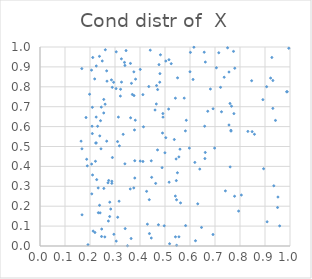
| Category | Series 0 |
|---|---|
| -100.0 | -100000 |
| -100.0 | -100000 |
| 0.19187879786047768 | 0.007 |
| -100.0 | -100000 |
| -100.0 | -100000 |
| -100.0 | -100000 |
| -100.0 | -100000 |
| -100.0 | -100000 |
| -100.0 | -100000 |
| -100.0 | -100000 |
| -100.0 | -100000 |
| -100.0 | -100000 |
| 0.4296224976861439 | 0.11 |
| -100.0 | -100000 |
| -100.0 | -100000 |
| -100.0 | -100000 |
| -100.0 | -100000 |
| -100.0 | -100000 |
| -100.0 | -100000 |
| -100.0 | -100000 |
| -100.0 | -100000 |
| -100.0 | -100000 |
| -100.0 | -100000 |
| -100.0 | -100000 |
| 0.2251686918316177 | 0.905 |
| -100.0 | -100000 |
| -100.0 | -100000 |
| -100.0 | -100000 |
| -100.0 | -100000 |
| -100.0 | -100000 |
| -100.0 | -100000 |
| -100.0 | -100000 |
| -100.0 | -100000 |
| -100.0 | -100000 |
| -100.0 | -100000 |
| -100.0 | -100000 |
| -100.0 | -100000 |
| -100.0 | -100000 |
| 0.20939885757398724 | 0.697 |
| -100.0 | -100000 |
| 0.5816440431107636 | 0.578 |
| -100.0 | -100000 |
| -100.0 | -100000 |
| -100.0 | -100000 |
| -100.0 | -100000 |
| -100.0 | -100000 |
| -100.0 | -100000 |
| -100.0 | -100000 |
| -100.0 | -100000 |
| -100.0 | -100000 |
| -100.0 | -100000 |
| -100.0 | -100000 |
| -100.0 | -100000 |
| -100.0 | -100000 |
| -100.0 | -100000 |
| -100.0 | -100000 |
| -100.0 | -100000 |
| -100.0 | -100000 |
| 0.7637295574614567 | 0.581 |
| 0.3050601643916153 | 0.025 |
| -100.0 | -100000 |
| 0.2553474817145608 | 0.289 |
| -100.0 | -100000 |
| -100.0 | -100000 |
| 0.49203139905379956 | 0.648 |
| 0.2667020137794205 | 0.88 |
| 0.9065603821030419 | 0.8 |
| 0.18915653105718144 | 0.403 |
| -100.0 | -100000 |
| -100.0 | -100000 |
| -100.0 | -100000 |
| -100.0 | -100000 |
| -100.0 | -100000 |
| -100.0 | -100000 |
| -100.0 | -100000 |
| -100.0 | -100000 |
| -100.0 | -100000 |
| -100.0 | -100000 |
| -100.0 | -100000 |
| 0.7639932975936461 | 0.577 |
| -100.0 | -100000 |
| -100.0 | -100000 |
| -100.0 | -100000 |
| -100.0 | -100000 |
| -100.0 | -100000 |
| -100.0 | -100000 |
| -100.0 | -100000 |
| -100.0 | -100000 |
| -100.0 | -100000 |
| -100.0 | -100000 |
| -100.0 | -100000 |
| -100.0 | -100000 |
| -100.0 | -100000 |
| -100.0 | -100000 |
| -100.0 | -100000 |
| 0.3822589108104296 | 0.838 |
| -100.0 | -100000 |
| -100.0 | -100000 |
| -100.0 | -100000 |
| -100.0 | -100000 |
| -100.0 | -100000 |
| -100.0 | -100000 |
| -100.0 | -100000 |
| -100.0 | -100000 |
| -100.0 | -100000 |
| -100.0 | -100000 |
| -100.0 | -100000 |
| -100.0 | -100000 |
| -100.0 | -100000 |
| -100.0 | -100000 |
| 0.5496870743826148 | 0.368 |
| -100.0 | -100000 |
| -100.0 | -100000 |
| -100.0 | -100000 |
| -100.0 | -100000 |
| -100.0 | -100000 |
| 0.9418769743370389 | 0.631 |
| 0.3256701429219151 | 0.94 |
| 0.7740199675463291 | 0.978 |
| -100.0 | -100000 |
| 0.16433612483010096 | 0.527 |
| -100.0 | -100000 |
| 0.681617395554677 | 0.789 |
| -100.0 | -100000 |
| -100.0 | -100000 |
| -100.0 | -100000 |
| -100.0 | -100000 |
| 0.5502491938861755 | 0.845 |
| -100.0 | -100000 |
| -100.0 | -100000 |
| -100.0 | -100000 |
| 0.3327204524582331 | 0.561 |
| -100.0 | -100000 |
| -100.0 | -100000 |
| -100.0 | -100000 |
| -100.0 | -100000 |
| -100.0 | -100000 |
| -100.0 | -100000 |
| -100.0 | -100000 |
| -100.0 | -100000 |
| -100.0 | -100000 |
| -100.0 | -100000 |
| -100.0 | -100000 |
| -100.0 | -100000 |
| -100.0 | -100000 |
| -100.0 | -100000 |
| -100.0 | -100000 |
| -100.0 | -100000 |
| 0.282922323134851 | 0.186 |
| -100.0 | -100000 |
| 0.6611241601250445 | 0.47 |
| -100.0 | -100000 |
| -100.0 | -100000 |
| 0.25502019649960594 | 0.737 |
| -100.0 | -100000 |
| 0.34988766715490793 | 0.001 |
| -100.0 | -100000 |
| -100.0 | -100000 |
| -100.0 | -100000 |
| 0.4466318419540014 | 0.345 |
| -100.0 | -100000 |
| -100.0 | -100000 |
| -100.0 | -100000 |
| -100.0 | -100000 |
| 0.4704986228340291 | 0.786 |
| -100.0 | -100000 |
| -100.0 | -100000 |
| -100.0 | -100000 |
| -100.0 | -100000 |
| -100.0 | -100000 |
| -100.0 | -100000 |
| -100.0 | -100000 |
| -100.0 | -100000 |
| -100.0 | -100000 |
| -100.0 | -100000 |
| 0.6155970152128075 | 0.999 |
| -100.0 | -100000 |
| -100.0 | -100000 |
| -100.0 | -100000 |
| -100.0 | -100000 |
| -100.0 | -100000 |
| 0.21974380534102522 | 0.068 |
| -100.0 | -100000 |
| -100.0 | -100000 |
| -100.0 | -100000 |
| -100.0 | -100000 |
| -100.0 | -100000 |
| -100.0 | -100000 |
| -100.0 | -100000 |
| -100.0 | -100000 |
| -100.0 | -100000 |
| -100.0 | -100000 |
| -100.0 | -100000 |
| -100.0 | -100000 |
| -100.0 | -100000 |
| 0.37521510980602013 | 0.292 |
| -100.0 | -100000 |
| -100.0 | -100000 |
| -100.0 | -100000 |
| 0.3624422175529668 | 0.644 |
| -100.0 | -100000 |
| -100.0 | -100000 |
| -100.0 | -100000 |
| 0.44523287967693836 | 0.04 |
| 0.4789717255678654 | 0.823 |
| -100.0 | -100000 |
| -100.0 | -100000 |
| -100.0 | -100000 |
| -100.0 | -100000 |
| -100.0 | -100000 |
| -100.0 | -100000 |
| -100.0 | -100000 |
| -100.0 | -100000 |
| 0.4351982912702477 | 0.801 |
| 0.7599091323669214 | 0.716 |
| -100.0 | -100000 |
| 0.278606509897224 | 0.148 |
| -100.0 | -100000 |
| -100.0 | -100000 |
| -100.0 | -100000 |
| 0.5852058785735164 | 0.632 |
| 0.2613730196282348 | 0.986 |
| -100.0 | -100000 |
| -100.0 | -100000 |
| -100.0 | -100000 |
| -100.0 | -100000 |
| 0.8315266321342155 | 0.576 |
| -100.0 | -100000 |
| -100.0 | -100000 |
| -100.0 | -100000 |
| 0.6596618350748987 | 0.439 |
| -100.0 | -100000 |
| -100.0 | -100000 |
| -100.0 | -100000 |
| -100.0 | -100000 |
| -100.0 | -100000 |
| -100.0 | -100000 |
| -100.0 | -100000 |
| 0.7503182706500822 | 0.996 |
| -100.0 | -100000 |
| -100.0 | -100000 |
| -100.0 | -100000 |
| -100.0 | -100000 |
| -100.0 | -100000 |
| -100.0 | -100000 |
| -100.0 | -100000 |
| -100.0 | -100000 |
| -100.0 | -100000 |
| -100.0 | -100000 |
| -100.0 | -100000 |
| -100.0 | -100000 |
| -100.0 | -100000 |
| -100.0 | -100000 |
| -100.0 | -100000 |
| -100.0 | -100000 |
| -100.0 | -100000 |
| -100.0 | -100000 |
| -100.0 | -100000 |
| -100.0 | -100000 |
| -100.0 | -100000 |
| -100.0 | -100000 |
| -100.0 | -100000 |
| -100.0 | -100000 |
| -100.0 | -100000 |
| -100.0 | -100000 |
| -100.0 | -100000 |
| -100.0 | -100000 |
| -100.0 | -100000 |
| -100.0 | -100000 |
| -100.0 | -100000 |
| -100.0 | -100000 |
| -100.0 | -100000 |
| -100.0 | -100000 |
| 0.33795944759262986 | 0.923 |
| -100.0 | -100000 |
| -100.0 | -100000 |
| -100.0 | -100000 |
| -100.0 | -100000 |
| -100.0 | -100000 |
| -100.0 | -100000 |
| -100.0 | -100000 |
| 0.23914817014861622 | 0.553 |
| -100.0 | -100000 |
| -100.0 | -100000 |
| -100.0 | -100000 |
| -100.0 | -100000 |
| -100.0 | -100000 |
| 0.24680507783390082 | 0.085 |
| -100.0 | -100000 |
| 0.23783188197156513 | 0.953 |
| -100.0 | -100000 |
| -100.0 | -100000 |
| -100.0 | -100000 |
| -100.0 | -100000 |
| -100.0 | -100000 |
| -100.0 | -100000 |
| 0.34424693027069375 | 0.982 |
| -100.0 | -100000 |
| -100.0 | -100000 |
| -100.0 | -100000 |
| -100.0 | -100000 |
| -100.0 | -100000 |
| -100.0 | -100000 |
| -100.0 | -100000 |
| -100.0 | -100000 |
| -100.0 | -100000 |
| -100.0 | -100000 |
| 0.6391309777898468 | 0.387 |
| -100.0 | -100000 |
| 0.16731013530644934 | 0.891 |
| -100.0 | -100000 |
| -100.0 | -100000 |
| -100.0 | -100000 |
| 0.20828665464862384 | 0.602 |
| -100.0 | -100000 |
| -100.0 | -100000 |
| -100.0 | -100000 |
| 0.38118780702664146 | 0.632 |
| -100.0 | -100000 |
| -100.0 | -100000 |
| -100.0 | -100000 |
| -100.0 | -100000 |
| -100.0 | -100000 |
| 0.5032850026031422 | 0.929 |
| 0.6016906126865291 | 0.973 |
| -100.0 | -100000 |
| -100.0 | -100000 |
| 0.23047496795832656 | 0.602 |
| -100.0 | -100000 |
| -100.0 | -100000 |
| -100.0 | -100000 |
| -100.0 | -100000 |
| -100.0 | -100000 |
| -100.0 | -100000 |
| -100.0 | -100000 |
| -100.0 | -100000 |
| 0.37913019498877587 | 0.429 |
| -100.0 | -100000 |
| -100.0 | -100000 |
| -100.0 | -100000 |
| -100.0 | -100000 |
| -100.0 | -100000 |
| -100.0 | -100000 |
| -100.0 | -100000 |
| -100.0 | -100000 |
| -100.0 | -100000 |
| -100.0 | -100000 |
| -100.0 | -100000 |
| -100.0 | -100000 |
| 0.9587002853319889 | 0.101 |
| -100.0 | -100000 |
| 0.30500730674287335 | 0.976 |
| 0.3163226875464985 | 0.225 |
| -100.0 | -100000 |
| -100.0 | -100000 |
| -100.0 | -100000 |
| -100.0 | -100000 |
| -100.0 | -100000 |
| -100.0 | -100000 |
| -100.0 | -100000 |
| -100.0 | -100000 |
| 0.7559870351411391 | 0.874 |
| -100.0 | -100000 |
| -100.0 | -100000 |
| -100.0 | -100000 |
| -100.0 | -100000 |
| -100.0 | -100000 |
| -100.0 | -100000 |
| 0.16779261318989291 | 0.488 |
| -100.0 | -100000 |
| -100.0 | -100000 |
| -100.0 | -100000 |
| -100.0 | -100000 |
| -100.0 | -100000 |
| 0.376183444377469 | 0.756 |
| -100.0 | -100000 |
| -100.0 | -100000 |
| -100.0 | -100000 |
| -100.0 | -100000 |
| -100.0 | -100000 |
| -100.0 | -100000 |
| -100.0 | -100000 |
| -100.0 | -100000 |
| -100.0 | -100000 |
| -100.0 | -100000 |
| 0.6920109922518849 | 0.058 |
| 0.30435218441106715 | 0.791 |
| -100.0 | -100000 |
| -100.0 | -100000 |
| -100.0 | -100000 |
| 0.7943881429237363 | 0.175 |
| -100.0 | -100000 |
| -100.0 | -100000 |
| -100.0 | -100000 |
| -100.0 | -100000 |
| -100.0 | -100000 |
| -100.0 | -100000 |
| -100.0 | -100000 |
| -100.0 | -100000 |
| -100.0 | -100000 |
| -100.0 | -100000 |
| -100.0 | -100000 |
| -100.0 | -100000 |
| -100.0 | -100000 |
| -100.0 | -100000 |
| -100.0 | -100000 |
| 0.20650176269031983 | 0.412 |
| -100.0 | -100000 |
| -100.0 | -100000 |
| -100.0 | -100000 |
| 0.894416459786068 | 0.388 |
| -100.0 | -100000 |
| -100.0 | -100000 |
| 0.5158422454907788 | 0.936 |
| -100.0 | -100000 |
| -100.0 | -100000 |
| -100.0 | -100000 |
| -100.0 | -100000 |
| 0.4263880408014544 | 0.275 |
| -100.0 | -100000 |
| -100.0 | -100000 |
| -100.0 | -100000 |
| -100.0 | -100000 |
| 0.22471361010595137 | 0.648 |
| 0.3175891911530946 | 0.503 |
| -100.0 | -100000 |
| -100.0 | -100000 |
| -100.0 | -100000 |
| -100.0 | -100000 |
| -100.0 | -100000 |
| -100.0 | -100000 |
| -100.0 | -100000 |
| -100.0 | -100000 |
| -100.0 | -100000 |
| -100.0 | -100000 |
| -100.0 | -100000 |
| -100.0 | -100000 |
| -100.0 | -100000 |
| -100.0 | -100000 |
| -100.0 | -100000 |
| -100.0 | -100000 |
| -100.0 | -100000 |
| -100.0 | -100000 |
| 0.4370916397126354 | 0.233 |
| 0.9224302886151942 | 0.844 |
| -100.0 | -100000 |
| -100.0 | -100000 |
| -100.0 | -100000 |
| -100.0 | -100000 |
| -100.0 | -100000 |
| -100.0 | -100000 |
| -100.0 | -100000 |
| -100.0 | -100000 |
| -100.0 | -100000 |
| -100.0 | -100000 |
| -100.0 | -100000 |
| -100.0 | -100000 |
| -100.0 | -100000 |
| 0.37546543730731485 | 0.875 |
| -100.0 | -100000 |
| 0.2187454687769319 | 0.84 |
| -100.0 | -100000 |
| -100.0 | -100000 |
| -100.0 | -100000 |
| -100.0 | -100000 |
| 0.27189752846479587 | 0.318 |
| -100.0 | -100000 |
| -100.0 | -100000 |
| -100.0 | -100000 |
| -100.0 | -100000 |
| -100.0 | -100000 |
| -100.0 | -100000 |
| -100.0 | -100000 |
| -100.0 | -100000 |
| -100.0 | -100000 |
| 0.43771643095411816 | 0.062 |
| -100.0 | -100000 |
| -100.0 | -100000 |
| 0.2228108382298407 | 0.517 |
| 0.7790921357145734 | 0.893 |
| -100.0 | -100000 |
| -100.0 | -100000 |
| -100.0 | -100000 |
| -100.0 | -100000 |
| -100.0 | -100000 |
| -100.0 | -100000 |
| -100.0 | -100000 |
| -100.0 | -100000 |
| -100.0 | -100000 |
| 0.6568691607360193 | 0.974 |
| -100.0 | -100000 |
| -100.0 | -100000 |
| -100.0 | -100000 |
| -100.0 | -100000 |
| -100.0 | -100000 |
| -100.0 | -100000 |
| -100.0 | -100000 |
| -100.0 | -100000 |
| -100.0 | -100000 |
| -100.0 | -100000 |
| -100.0 | -100000 |
| -100.0 | -100000 |
| -100.0 | -100000 |
| -100.0 | -100000 |
| -100.0 | -100000 |
| -100.0 | -100000 |
| 0.23341933274696025 | 0.167 |
| -100.0 | -100000 |
| -100.0 | -100000 |
| -100.0 | -100000 |
| -100.0 | -100000 |
| -100.0 | -100000 |
| -100.0 | -100000 |
| -100.0 | -100000 |
| 0.22512395210268232 | 0.518 |
| -100.0 | -100000 |
| -100.0 | -100000 |
| -100.0 | -100000 |
| -100.0 | -100000 |
| -100.0 | -100000 |
| 0.31070677299256033 | 0.144 |
| -100.0 | -100000 |
| -100.0 | -100000 |
| -100.0 | -100000 |
| -100.0 | -100000 |
| -100.0 | -100000 |
| -100.0 | -100000 |
| -100.0 | -100000 |
| -100.0 | -100000 |
| -100.0 | -100000 |
| -100.0 | -100000 |
| -100.0 | -100000 |
| -100.0 | -100000 |
| -100.0 | -100000 |
| 0.8055011477738415 | 0.256 |
| -100.0 | -100000 |
| -100.0 | -100000 |
| -100.0 | -100000 |
| -100.0 | -100000 |
| -100.0 | -100000 |
| -100.0 | -100000 |
| 0.582386269931465 | 0.103 |
| -100.0 | -100000 |
| -100.0 | -100000 |
| -100.0 | -100000 |
| -100.0 | -100000 |
| -100.0 | -100000 |
| -100.0 | -100000 |
| 0.9353104379878 | 0.302 |
| -100.0 | -100000 |
| -100.0 | -100000 |
| -100.0 | -100000 |
| -100.0 | -100000 |
| -100.0 | -100000 |
| 0.555597384610156 | 0.448 |
| -100.0 | -100000 |
| -100.0 | -100000 |
| -100.0 | -100000 |
| -100.0 | -100000 |
| 0.20932897513727833 | 0.565 |
| -100.0 | -100000 |
| 0.2451965008652771 | 0.698 |
| -100.0 | -100000 |
| -100.0 | -100000 |
| -100.0 | -100000 |
| -100.0 | -100000 |
| -100.0 | -100000 |
| 0.3618406845669442 | 0.918 |
| -100.0 | -100000 |
| 0.27352491304284776 | 0.125 |
| -100.0 | -100000 |
| -100.0 | -100000 |
| 0.698445414171746 | 0.492 |
| 0.8915782337760583 | 0.735 |
| 0.3215353931150503 | 0.753 |
| -100.0 | -100000 |
| 0.5165515494945132 | 0.321 |
| -100.0 | -100000 |
| -100.0 | -100000 |
| -100.0 | -100000 |
| -100.0 | -100000 |
| -100.0 | -100000 |
| 0.736762711610288 | 0.848 |
| -100.0 | -100000 |
| -100.0 | -100000 |
| 0.5462561134884889 | 0.232 |
| 0.37790903698737244 | 0.583 |
| -100.0 | -100000 |
| 0.23821711912621968 | 0.205 |
| 0.3102538954576177 | 0.525 |
| -100.0 | -100000 |
| -100.0 | -100000 |
| -100.0 | -100000 |
| -100.0 | -100000 |
| -100.0 | -100000 |
| 0.9502939386492661 | 0.194 |
| -100.0 | -100000 |
| -100.0 | -100000 |
| -100.0 | -100000 |
| -100.0 | -100000 |
| -100.0 | -100000 |
| -100.0 | -100000 |
| -100.0 | -100000 |
| -100.0 | -100000 |
| -100.0 | -100000 |
| 0.2873610719695805 | 0.315 |
| -100.0 | -100000 |
| 0.6710027540885751 | 0.677 |
| -100.0 | -100000 |
| -100.0 | -100000 |
| -100.0 | -100000 |
| -100.0 | -100000 |
| -100.0 | -100000 |
| -100.0 | -100000 |
| -100.0 | -100000 |
| 0.1866818977305128 | 0.436 |
| -100.0 | -100000 |
| -100.0 | -100000 |
| -100.0 | -100000 |
| 0.4662170571116231 | 0.806 |
| -100.0 | -100000 |
| -100.0 | -100000 |
| -100.0 | -100000 |
| -100.0 | -100000 |
| -100.0 | -100000 |
| -100.0 | -100000 |
| -100.0 | -100000 |
| -100.0 | -100000 |
| -100.0 | -100000 |
| 0.3610351131361368 | 0.287 |
| 0.541670181146668 | 0.743 |
| -100.0 | -100000 |
| -100.0 | -100000 |
| -100.0 | -100000 |
| -100.0 | -100000 |
| 0.7606733434378987 | 0.397 |
| -100.0 | -100000 |
| -100.0 | -100000 |
| -100.0 | -100000 |
| -100.0 | -100000 |
| -100.0 | -100000 |
| -100.0 | -100000 |
| -100.0 | -100000 |
| -100.0 | -100000 |
| -100.0 | -100000 |
| -100.0 | -100000 |
| -100.0 | -100000 |
| -100.0 | -100000 |
| 0.5599872243091598 | 0.486 |
| -100.0 | -100000 |
| -100.0 | -100000 |
| -100.0 | -100000 |
| -100.0 | -100000 |
| -100.0 | -100000 |
| 0.49159442339425374 | 0.666 |
| -100.0 | -100000 |
| 0.9314279714402884 | 0.691 |
| -100.0 | -100000 |
| -100.0 | -100000 |
| -100.0 | -100000 |
| -100.0 | -100000 |
| -100.0 | -100000 |
| -100.0 | -100000 |
| -100.0 | -100000 |
| -100.0 | -100000 |
| -100.0 | -100000 |
| -100.0 | -100000 |
| -100.0 | -100000 |
| -100.0 | -100000 |
| 0.9951383937138106 | 0.994 |
| -100.0 | -100000 |
| 0.21023838530924832 | 0.357 |
| -100.0 | -100000 |
| -100.0 | -100000 |
| 0.24899661968324804 | 0.93 |
| -100.0 | -100000 |
| -100.0 | -100000 |
| -100.0 | -100000 |
| -100.0 | -100000 |
| 0.9315422521077081 | 0.832 |
| -100.0 | -100000 |
| -100.0 | -100000 |
| -100.0 | -100000 |
| -100.0 | -100000 |
| 0.5452791084124988 | 0.329 |
| -100.0 | -100000 |
| -100.0 | -100000 |
| 0.23275767309322692 | 0.292 |
| -100.0 | -100000 |
| -100.0 | -100000 |
| 0.988968515245191 | 0.775 |
| -100.0 | -100000 |
| -100.0 | -100000 |
| 0.597468689486578 | 0.492 |
| -100.0 | -100000 |
| -100.0 | -100000 |
| -100.0 | -100000 |
| -100.0 | -100000 |
| -100.0 | -100000 |
| -100.0 | -100000 |
| -100.0 | -100000 |
| 0.2746716950019883 | 0.329 |
| -100.0 | -100000 |
| 0.20612441613082955 | 0.884 |
| -100.0 | -100000 |
| -100.0 | -100000 |
| 0.5999396826141097 | 0.876 |
| -100.0 | -100000 |
| -100.0 | -100000 |
| -100.0 | -100000 |
| -100.0 | -100000 |
| -100.0 | -100000 |
| 0.21258200194332366 | 0.075 |
| -100.0 | -100000 |
| -100.0 | -100000 |
| -100.0 | -100000 |
| -100.0 | -100000 |
| -100.0 | -100000 |
| -100.0 | -100000 |
| -100.0 | -100000 |
| -100.0 | -100000 |
| -100.0 | -100000 |
| -100.0 | -100000 |
| 0.44105098137775434 | 0.984 |
| -100.0 | -100000 |
| -100.0 | -100000 |
| 0.21110580276425195 | 0.947 |
| -100.0 | -100000 |
| -100.0 | -100000 |
| 0.4116622878513345 | 0.761 |
| -100.0 | -100000 |
| 0.3407192627931094 | 0.087 |
| -100.0 | -100000 |
| -100.0 | -100000 |
| 0.41385437623360777 | 0.599 |
| -100.0 | -100000 |
| 0.4817336766026966 | 0.961 |
| -100.0 | -100000 |
| 0.5248868619039916 | 0.916 |
| 0.6586281720351973 | 0.602 |
| -100.0 | -100000 |
| 0.3223727914639689 | 0.788 |
| -100.0 | -100000 |
| 0.2593472433746231 | 0.046 |
| -100.0 | -100000 |
| -100.0 | -100000 |
| -100.0 | -100000 |
| -100.0 | -100000 |
| -100.0 | -100000 |
| -100.0 | -100000 |
| -100.0 | -100000 |
| -100.0 | -100000 |
| 0.37920057562293696 | 0.342 |
| -100.0 | -100000 |
| -100.0 | -100000 |
| -100.0 | -100000 |
| -100.0 | -100000 |
| -100.0 | -100000 |
| -100.0 | -100000 |
| 0.4996907973285465 | 0.468 |
| -100.0 | -100000 |
| -100.0 | -100000 |
| 0.4653388486033244 | 0.714 |
| -100.0 | -100000 |
| -100.0 | -100000 |
| -100.0 | -100000 |
| -100.0 | -100000 |
| -100.0 | -100000 |
| -100.0 | -100000 |
| 0.5621662886144818 | 0.217 |
| -100.0 | -100000 |
| 0.6613810115313914 | 0.924 |
| -100.0 | -100000 |
| -100.0 | -100000 |
| 0.3694266199553855 | 0.761 |
| 0.4884188600730133 | 0.394 |
| -100.0 | -100000 |
| 0.6193978670536209 | 0.42 |
| -100.0 | -100000 |
| -100.0 | -100000 |
| 0.5557759700371547 | 0.046 |
| 0.1983826988384887 | 0.763 |
| -100.0 | -100000 |
| -100.0 | -100000 |
| -100.0 | -100000 |
| -100.0 | -100000 |
| -100.0 | -100000 |
| -100.0 | -100000 |
| -100.0 | -100000 |
| -100.0 | -100000 |
| -100.0 | -100000 |
| -100.0 | -100000 |
| -100.0 | -100000 |
| 0.7222283674976765 | 0.797 |
| -100.0 | -100000 |
| 0.47975809419131754 | 0.866 |
| -100.0 | -100000 |
| -100.0 | -100000 |
| -100.0 | -100000 |
| -100.0 | -100000 |
| -100.0 | -100000 |
| -100.0 | -100000 |
| -100.0 | -100000 |
| -100.0 | -100000 |
| -100.0 | -100000 |
| -100.0 | -100000 |
| -100.0 | -100000 |
| 0.2891202515745286 | 0.797 |
| -100.0 | -100000 |
| -100.0 | -100000 |
| -100.0 | -100000 |
| -100.0 | -100000 |
| -100.0 | -100000 |
| -100.0 | -100000 |
| -100.0 | -100000 |
| -100.0 | -100000 |
| -100.0 | -100000 |
| -100.0 | -100000 |
| -100.0 | -100000 |
| -100.0 | -100000 |
| -100.0 | -100000 |
| -100.0 | -100000 |
| -100.0 | -100000 |
| -100.0 | -100000 |
| 0.8485638244472773 | 0.575 |
| -100.0 | -100000 |
| -100.0 | -100000 |
| -100.0 | -100000 |
| -100.0 | -100000 |
| -100.0 | -100000 |
| -100.0 | -100000 |
| -100.0 | -100000 |
| -100.0 | -100000 |
| -100.0 | -100000 |
| -100.0 | -100000 |
| -100.0 | -100000 |
| -100.0 | -100000 |
| 0.3658313003531096 | 0.817 |
| -100.0 | -100000 |
| -100.0 | -100000 |
| -100.0 | -100000 |
| -100.0 | -100000 |
| -100.0 | -100000 |
| -100.0 | -100000 |
| -100.0 | -100000 |
| -100.0 | -100000 |
| -100.0 | -100000 |
| -100.0 | -100000 |
| -100.0 | -100000 |
| 0.2790518279686339 | 0.22 |
| -100.0 | -100000 |
| 0.7152152422028835 | 0.971 |
| -100.0 | -100000 |
| -100.0 | -100000 |
| -100.0 | -100000 |
| -100.0 | -100000 |
| -100.0 | -100000 |
| -100.0 | -100000 |
| -100.0 | -100000 |
| -100.0 | -100000 |
| -100.0 | -100000 |
| 0.3397003891745447 | 0.907 |
| -100.0 | -100000 |
| -100.0 | -100000 |
| -100.0 | -100000 |
| -100.0 | -100000 |
| -100.0 | -100000 |
| -100.0 | -100000 |
| 0.2895513735991486 | 0.445 |
| -100.0 | -100000 |
| 0.8465553823371011 | 0.831 |
| -100.0 | -100000 |
| -100.0 | -100000 |
| -100.0 | -100000 |
| -100.0 | -100000 |
| -100.0 | -100000 |
| -100.0 | -100000 |
| -100.0 | -100000 |
| -100.0 | -100000 |
| -100.0 | -100000 |
| 0.24045085899455299 | 0.166 |
| -100.0 | -100000 |
| -100.0 | -100000 |
| -100.0 | -100000 |
| -100.0 | -100000 |
| 0.5413917241796974 | 0.251 |
| -100.0 | -100000 |
| -100.0 | -100000 |
| -100.0 | -100000 |
| -100.0 | -100000 |
| -100.0 | -100000 |
| -100.0 | -100000 |
| -100.0 | -100000 |
| -100.0 | -100000 |
| -100.0 | -100000 |
| -100.0 | -100000 |
| -100.0 | -100000 |
| -100.0 | -100000 |
| 0.401118358799745 | 0.887 |
| -100.0 | -100000 |
| -100.0 | -100000 |
| -100.0 | -100000 |
| -100.0 | -100000 |
| -100.0 | -100000 |
| 0.28581587674909426 | 0.835 |
| -100.0 | -100000 |
| 0.3259898915490892 | 0.824 |
| -100.0 | -100000 |
| -100.0 | -100000 |
| -100.0 | -100000 |
| -100.0 | -100000 |
| -100.0 | -100000 |
| -100.0 | -100000 |
| -100.0 | -100000 |
| -100.0 | -100000 |
| -100.0 | -100000 |
| 0.24212587864365143 | 0.63 |
| -100.0 | -100000 |
| -100.0 | -100000 |
| -100.0 | -100000 |
| -100.0 | -100000 |
| -100.0 | -100000 |
| -100.0 | -100000 |
| -100.0 | -100000 |
| 0.5768191920200989 | 0.743 |
| -100.0 | -100000 |
| -100.0 | -100000 |
| -100.0 | -100000 |
| -100.0 | -100000 |
| 0.22178904538462862 | 0.426 |
| -100.0 | -100000 |
| -100.0 | -100000 |
| -100.0 | -100000 |
| -100.0 | -100000 |
| -100.0 | -100000 |
| -100.0 | -100000 |
| -100.0 | -100000 |
| -100.0 | -100000 |
| -100.0 | -100000 |
| -100.0 | -100000 |
| -100.0 | -100000 |
| -100.0 | -100000 |
| -100.0 | -100000 |
| -100.0 | -100000 |
| -100.0 | -100000 |
| -100.0 | -100000 |
| -100.0 | -100000 |
| -100.0 | -100000 |
| -100.0 | -100000 |
| 0.6219227901636352 | 0.026 |
| -100.0 | -100000 |
| -100.0 | -100000 |
| -100.0 | -100000 |
| -100.0 | -100000 |
| -100.0 | -100000 |
| -100.0 | -100000 |
| -100.0 | -100000 |
| -100.0 | -100000 |
| -100.0 | -100000 |
| -100.0 | -100000 |
| -100.0 | -100000 |
| -100.0 | -100000 |
| -100.0 | -100000 |
| -100.0 | -100000 |
| -100.0 | -100000 |
| -100.0 | -100000 |
| -100.0 | -100000 |
| -100.0 | -100000 |
| -100.0 | -100000 |
| -100.0 | -100000 |
| -100.0 | -100000 |
| -100.0 | -100000 |
| -100.0 | -100000 |
| 0.5372513183213166 | 0.535 |
| -100.0 | -100000 |
| -100.0 | -100000 |
| -100.0 | -100000 |
| -100.0 | -100000 |
| -100.0 | -100000 |
| -100.0 | -100000 |
| -100.0 | -100000 |
| -100.0 | -100000 |
| -100.0 | -100000 |
| -100.0 | -100000 |
| -100.0 | -100000 |
| -100.0 | -100000 |
| -100.0 | -100000 |
| -100.0 | -100000 |
| -100.0 | -100000 |
| -100.0 | -100000 |
| -100.0 | -100000 |
| -100.0 | -100000 |
| -100.0 | -100000 |
| -100.0 | -100000 |
| -100.0 | -100000 |
| -100.0 | -100000 |
| 0.544466317788866 | 0.437 |
| -100.0 | -100000 |
| -100.0 | -100000 |
| -100.0 | -100000 |
| -100.0 | -100000 |
| -100.0 | -100000 |
| -100.0 | -100000 |
| -100.0 | -100000 |
| -100.0 | -100000 |
| -100.0 | -100000 |
| -100.0 | -100000 |
| -100.0 | -100000 |
| 0.4760254089343101 | 0.911 |
| -100.0 | -100000 |
| -100.0 | -100000 |
| -100.0 | -100000 |
| -100.0 | -100000 |
| -100.0 | -100000 |
| -100.0 | -100000 |
| -100.0 | -100000 |
| -100.0 | -100000 |
| -100.0 | -100000 |
| -100.0 | -100000 |
| -100.0 | -100000 |
| 0.24620833823263166 | 0.048 |
| -100.0 | -100000 |
| 0.24396287554375828 | 0.488 |
| -100.0 | -100000 |
| 0.26682284188201755 | 0.527 |
| -100.0 | -100000 |
| -100.0 | -100000 |
| -100.0 | -100000 |
| -100.0 | -100000 |
| 0.26800713240922225 | 0.828 |
| -100.0 | -100000 |
| -100.0 | -100000 |
| -100.0 | -100000 |
| -100.0 | -100000 |
| -100.0 | -100000 |
| -100.0 | -100000 |
| 0.47007889627485333 | 0.483 |
| -100.0 | -100000 |
| 0.16814942213434603 | 0.157 |
| -100.0 | -100000 |
| -100.0 | -100000 |
| -100.0 | -100000 |
| -100.0 | -100000 |
| -100.0 | -100000 |
| -100.0 | -100000 |
| -100.0 | -100000 |
| -100.0 | -100000 |
| -100.0 | -100000 |
| -100.0 | -100000 |
| -100.0 | -100000 |
| -100.0 | -100000 |
| -100.0 | -100000 |
| -100.0 | -100000 |
| -100.0 | -100000 |
| -100.0 | -100000 |
| -100.0 | -100000 |
| -100.0 | -100000 |
| -100.0 | -100000 |
| -100.0 | -100000 |
| -100.0 | -100000 |
| 0.36451257747274046 | 0.038 |
| -100.0 | -100000 |
| 0.7416212943139787 | 0.277 |
| -100.0 | -100000 |
| -100.0 | -100000 |
| -100.0 | -100000 |
| 0.9274636370874937 | 0.947 |
| -100.0 | -100000 |
| 0.29552333042247536 | 0.059 |
| 0.5144856794780535 | 0.688 |
| 0.4968469711366573 | 0.102 |
| -100.0 | -100000 |
| -100.0 | -100000 |
| -100.0 | -100000 |
| -100.0 | -100000 |
| -100.0 | -100000 |
| 0.7260121189864083 | 0.674 |
| -100.0 | -100000 |
| -100.0 | -100000 |
| -100.0 | -100000 |
| -100.0 | -100000 |
| -100.0 | -100000 |
| -100.0 | -100000 |
| -100.0 | -100000 |
| 0.4601863265841575 | 0.683 |
| 0.40088013520726296 | 0.427 |
| -100.0 | -100000 |
| -100.0 | -100000 |
| -100.0 | -100000 |
| -100.0 | -100000 |
| -100.0 | -100000 |
| 0.7560065297023854 | 0.608 |
| -100.0 | -100000 |
| 0.7056175805659578 | 0.896 |
| -100.0 | -100000 |
| -100.0 | -100000 |
| 0.8577922127039965 | 0.561 |
| 0.4450565565016976 | 0.428 |
| 0.6923559237371507 | 0.69 |
| -100.0 | -100000 |
| -100.0 | -100000 |
| 0.47368652360903285 | 0.107 |
| -100.0 | -100000 |
| -100.0 | -100000 |
| -100.0 | -100000 |
| -100.0 | -100000 |
| -100.0 | -100000 |
| -100.0 | -100000 |
| -100.0 | -100000 |
| -100.0 | -100000 |
| -100.0 | -100000 |
| -100.0 | -100000 |
| -100.0 | -100000 |
| -100.0 | -100000 |
| -100.0 | -100000 |
| 0.7660234392175441 | 0.703 |
| -100.0 | -100000 |
| 0.41182801773016753 | 0.425 |
| -100.0 | -100000 |
| -100.0 | -100000 |
| 0.20717434804876367 | 0.262 |
| -100.0 | -100000 |
| 0.2605128012499368 | 0.713 |
| -100.0 | -100000 |
| 0.775684601501334 | 0.665 |
| -100.0 | -100000 |
| -100.0 | -100000 |
| -100.0 | -100000 |
| -100.0 | -100000 |
| 0.4900500350771736 | 0.568 |
| 0.64610717437713 | 0.093 |
| -100.0 | -100000 |
| -100.0 | -100000 |
| 0.9518496557362567 | 0.246 |
| -100.0 | -100000 |
| -100.0 | -100000 |
| -100.0 | -100000 |
| 0.6309455862576209 | 0.212 |
| -100.0 | -100000 |
| -100.0 | -100000 |
| -100.0 | -100000 |
| -100.0 | -100000 |
| -100.0 | -100000 |
| -100.0 | -100000 |
| -100.0 | -100000 |
| -100.0 | -100000 |
| 0.9084951843181764 | 0.122 |
| 0.5184159441631183 | 0.011 |
| -100.0 | -100000 |
| -100.0 | -100000 |
| -100.0 | -100000 |
| -100.0 | -100000 |
| -100.0 | -100000 |
| -100.0 | -100000 |
| 0.7783734931368538 | 0.25 |
| 0.5418427939405085 | 0.046 |
| 0.9866158776606906 | 0.775 |
| 0.6122939101535667 | 0.837 |
| 0.3135548472391231 | 0.648 |
| -100.0 | -100000 |
| -100.0 | -100000 |
| 0.33955631194562874 | 0.413 |
| -100.0 | -100000 |
| 0.18411294512509713 | 0.646 |
| -100.0 | -100000 |
| -100.0 | -100000 |
| 0.46262761199990754 | 0.315 |
| -100.0 | -100000 |
| -100.0 | -100000 |
| -100.0 | -100000 |
| -100.0 | -100000 |
| -100.0 | -100000 |
| -100.0 | -100000 |
| 0.2549484953543869 | 0.669 |
| 0.28750037182133814 | 0.325 |
| -100.0 | -100000 |
| -100.0 | -100000 |
| -100.0 | -100000 |
| 0.5032417134034316 | 0.544 |
| -100.0 | -100000 |
| 0.29446091905118865 | 0.823 |
| -100.0 | -100000 |
| -100.0 | -100000 |
| 0.5464932255347902 | 0.003 |
| -100.0 | -100000 |
| -100.0 | -100000 |
| -100.0 | -100000 |
| -100.0 | -100000 |
| -100.0 | -100000 |
| -100.0 | -100000 |
| -100.0 | -100000 |
| -100.0 | -100000 |
| 0.2268155659145379 | 0.334 |
| -100.0 | -100000 |
| -100.0 | -100000 |
| -100.0 | -100000 |
| -100.0 | -100000 |
| -100.0 | -100000 |
| -100.0 | -100000 |
| -100.0 | -100000 |
| -100.0 | -100000 |
| -100.0 | -100000 |
| -100.0 | -100000 |
| -100.0 | -100000 |
| -100.0 | -100000 |
| -100.0 | -100000 |
| -100.0 | -100000 |
| -100.0 | -100000 |
| -100.0 | -100000 |
| -100.0 | -100000 |
| -100.0 | -100000 |
| -100.0 | -100000 |
| -100.0 | -100000 |